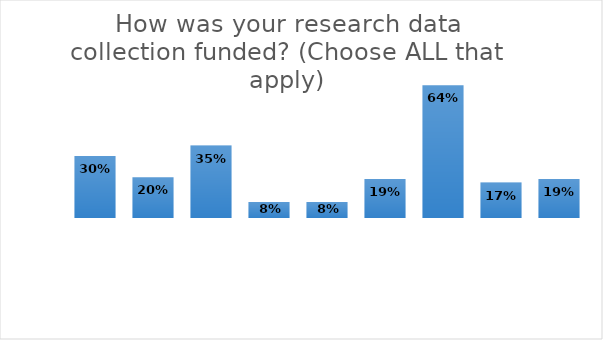
| Category | Series 0 |
|---|---|
|  | 0.299 |
|  | 0.197 |
|  | 0.35 |
|  | 0.077 |
|  | 0.077 |
|  | 0.188 |
|  | 0.641 |
|  | 0.171 |
|  | 0.188 |